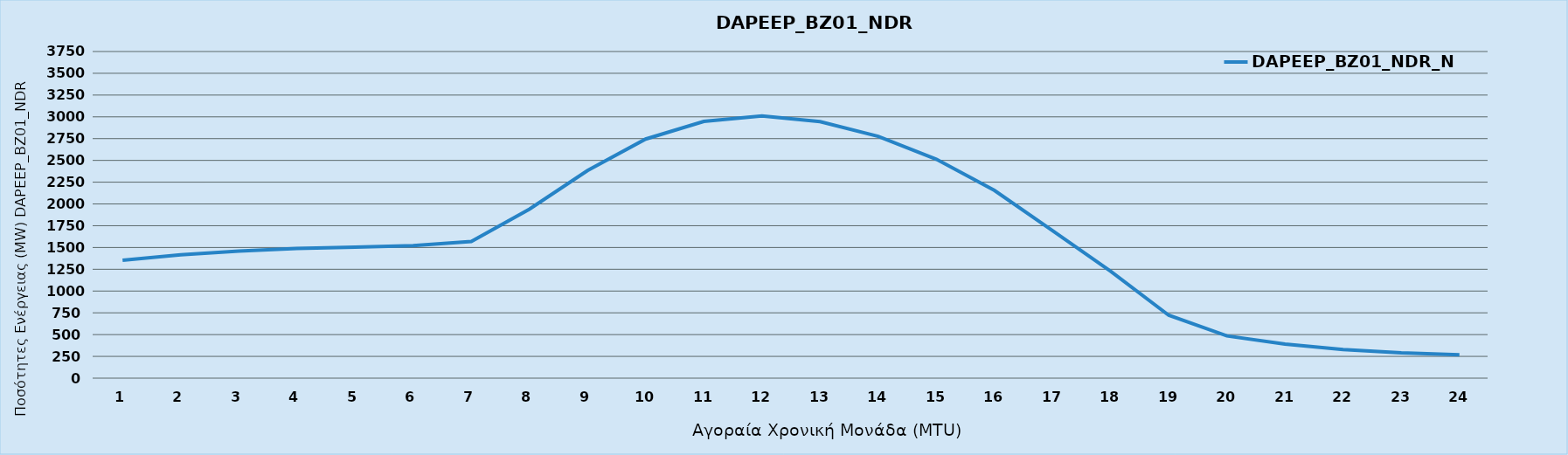
| Category | DAPEEP_BZ01_NDR_N1 |
|---|---|
| 0 | 1354 |
| 1 | 1417 |
| 2 | 1460 |
| 3 | 1489 |
| 4 | 1504 |
| 5 | 1522 |
| 6 | 1568 |
| 7 | 1940 |
| 8 | 2383 |
| 9 | 2745 |
| 10 | 2948 |
| 11 | 3010 |
| 12 | 2945 |
| 13 | 2776 |
| 14 | 2513 |
| 15 | 2155 |
| 16 | 1694 |
| 17 | 1226 |
| 18 | 722 |
| 19 | 485 |
| 20 | 390 |
| 21 | 328 |
| 22 | 290 |
| 23 | 267 |